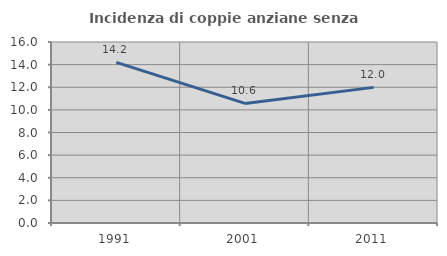
| Category | Incidenza di coppie anziane senza figli  |
|---|---|
| 1991.0 | 14.196 |
| 2001.0 | 10.571 |
| 2011.0 | 11.989 |